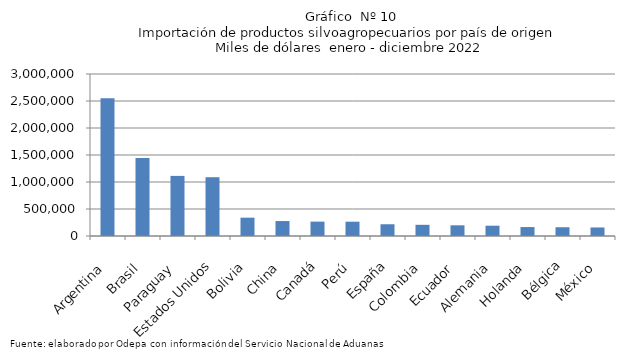
| Category | Series 0 |
|---|---|
| Argentina | 2552808.367 |
| Brasil | 1442402.87 |
| Paraguay | 1113009.863 |
| Estados Unidos | 1088285.468 |
| Bolivia | 339338.318 |
| China | 276908.524 |
| Canadá | 266350.056 |
| Perú | 264970.65 |
| España | 217443.817 |
| Colombia | 207224.138 |
| Ecuador | 198105.668 |
| Alemania | 190775.709 |
| Holanda | 165439.091 |
| Bélgica | 162122.863 |
| México | 157906.344 |